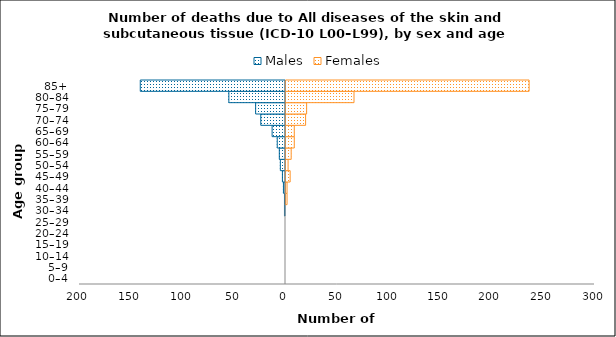
| Category | Males | Females |
|---|---|---|
| 0–4 | 0 | 0 |
| 5–9 | 0 | 0 |
| 10–14 | 0 | 0 |
| 15–19 | 0 | 0 |
| 20–24 | 0 | 0 |
| 25–29 | 0 | 0 |
| 30–34 | -1 | 0 |
| 35–39 | -1 | 2 |
| 40–44 | -2 | 2 |
| 45–49 | -3 | 5 |
| 50–54 | -5 | 3 |
| 55–59 | -6 | 6 |
| 60–64 | -8 | 9 |
| 65–69 | -13 | 9 |
| 70–74 | -24 | 20 |
| 75–79 | -29 | 21 |
| 80–84 | -55 | 67 |
| 85+ | -141 | 237 |